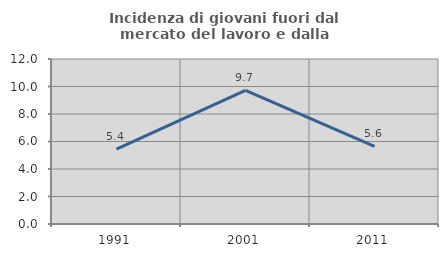
| Category | Incidenza di giovani fuori dal mercato del lavoro e dalla formazione  |
|---|---|
| 1991.0 | 5.437 |
| 2001.0 | 9.722 |
| 2011.0 | 5.639 |